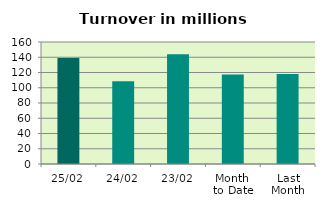
| Category | Series 0 |
|---|---|
| 25/02 | 139 |
| 24/02 | 108.407 |
| 23/02 | 143.871 |
| Month 
to Date | 117.379 |
| Last
Month | 118.136 |